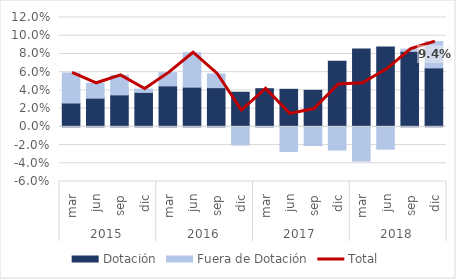
| Category | Dotación | Fuera de Dotación |
|---|---|---|
| 0 | 0.026 | 0.033 |
| 1 | 0.031 | 0.016 |
| 2 | 0.035 | 0.021 |
| 3 | 0.038 | 0.004 |
| 4 | 0.045 | 0.015 |
| 5 | 0.044 | 0.038 |
| 6 | 0.043 | 0.015 |
| 7 | 0.038 | -0.02 |
| 8 | 0.042 | 0 |
| 9 | 0.041 | -0.027 |
| 10 | 0.04 | -0.021 |
| 11 | 0.072 | -0.025 |
| 12 | 0.085 | -0.038 |
| 13 | 0.088 | -0.025 |
| 14 | 0.083 | 0.002 |
| 15 | 0.065 | 0.029 |